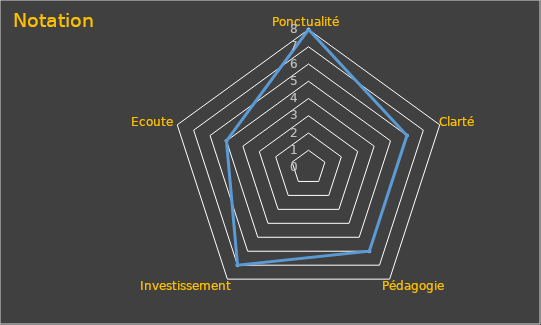
| Category | Note |
|---|---|
| Ponctualité | 8 |
| Clarté | 6 |
| Pédagogie | 6 |
| Investissement | 7 |
| Ecoute | 5 |